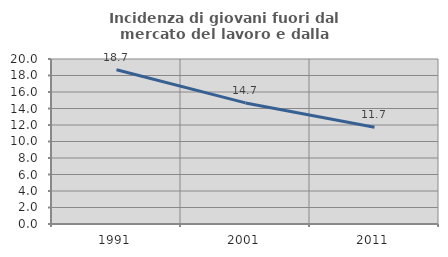
| Category | Incidenza di giovani fuori dal mercato del lavoro e dalla formazione  |
|---|---|
| 1991.0 | 18.692 |
| 2001.0 | 14.676 |
| 2011.0 | 11.719 |